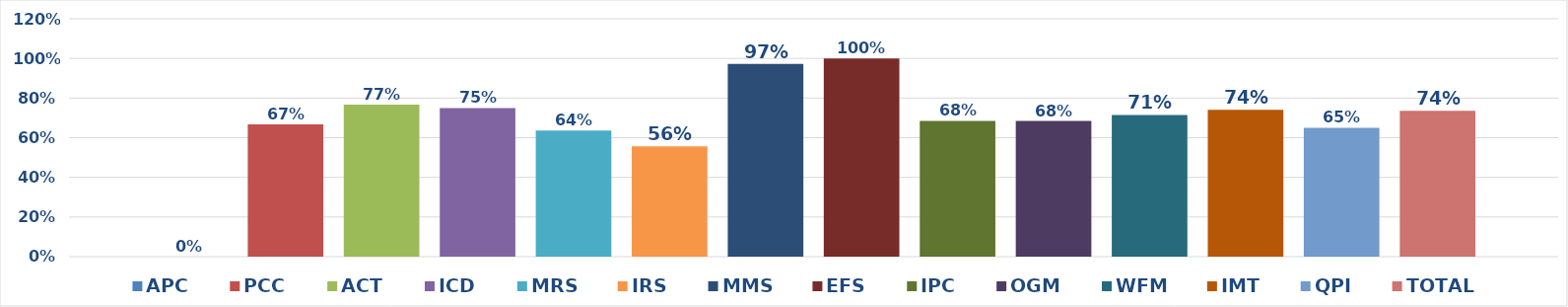
| Category | APC | PCC | ACT | ICD | MRS | IRS | MMS | EFS | IPC | OGM | WFM | IMT | QPI | TOTAL |
|---|---|---|---|---|---|---|---|---|---|---|---|---|---|---|
| 0 | 0 | 0.667 | 0.767 | 0.75 | 0.636 | 0.557 | 0.972 | 1 | 0.685 | 0.684 | 0.715 | 0.74 | 0.65 | 0.735 |